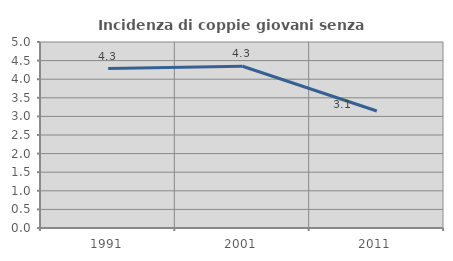
| Category | Incidenza di coppie giovani senza figli |
|---|---|
| 1991.0 | 4.286 |
| 2001.0 | 4.348 |
| 2011.0 | 3.145 |